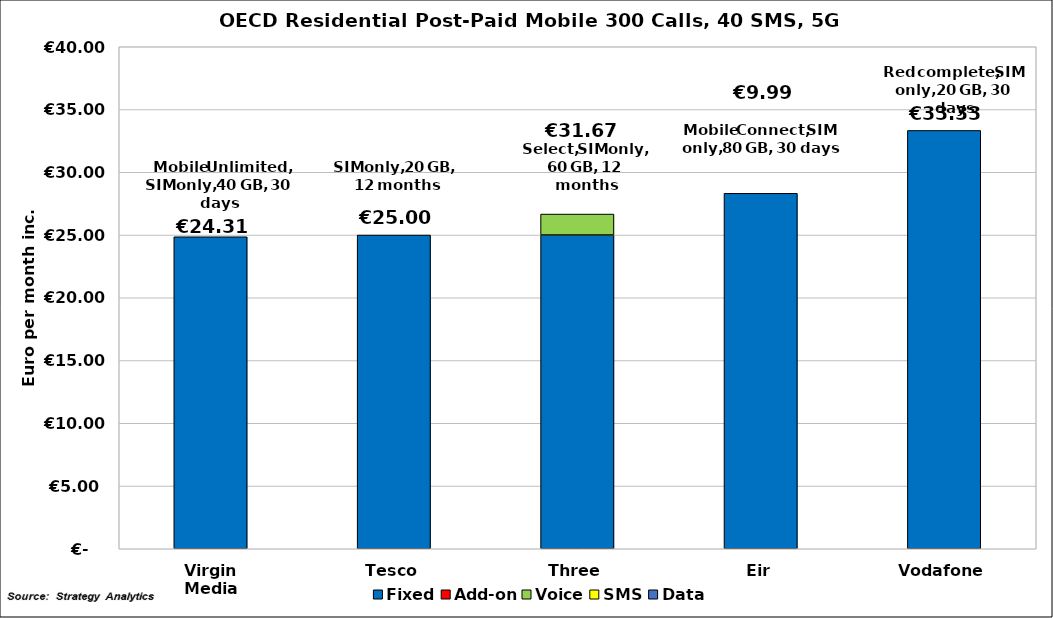
| Category | Fixed | Add-on | Voice | SMS | Data |
|---|---|---|---|---|---|
| Virgin Media | 24.861 | 0 | 0 | 0 | 0 |
| Tesco | 25 | 0 | 0 | 0 | 0 |
| Three | 25 | 0 | 1.67 | 0 | 0 |
| Eir | 28.323 | 0 | 0 | 0 | 0 |
| Vodafone | 33.333 | 0 | 0 | 0 | 0 |